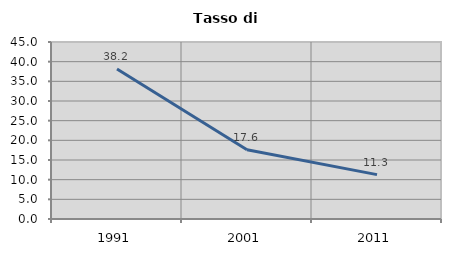
| Category | Tasso di disoccupazione   |
|---|---|
| 1991.0 | 38.154 |
| 2001.0 | 17.625 |
| 2011.0 | 11.284 |